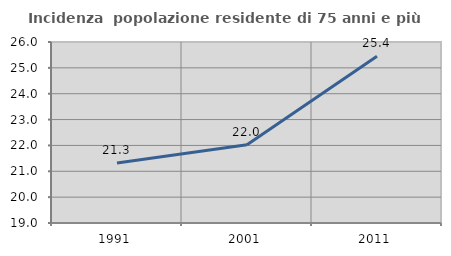
| Category | Incidenza  popolazione residente di 75 anni e più |
|---|---|
| 1991.0 | 21.318 |
| 2001.0 | 22.025 |
| 2011.0 | 25.448 |